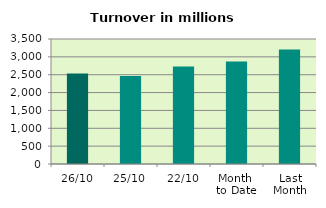
| Category | Series 0 |
|---|---|
| 26/10 | 2535.045 |
| 25/10 | 2463.835 |
| 22/10 | 2727.248 |
| Month 
to Date | 2869.666 |
| Last
Month | 3204.516 |